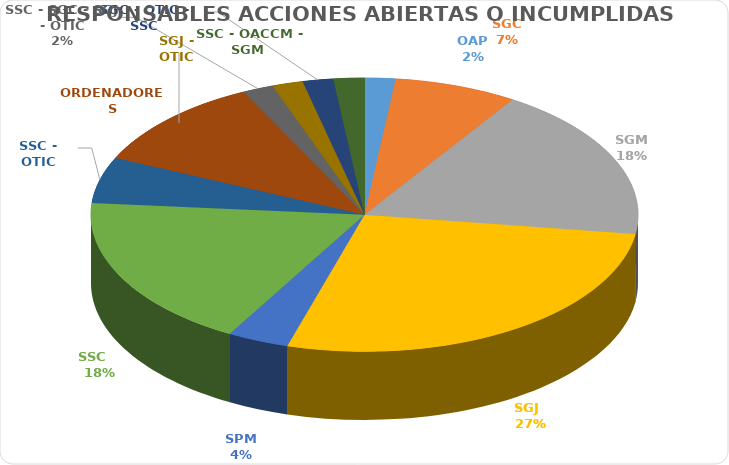
| Category | Series 0 |
|---|---|
| OAP | 1 |
| SGC | 4 |
| SGM | 10 |
| SGJ   | 15 |
| SPM | 2 |
| SSC    | 10 |
| SSC - OTIC | 3 |
| ORDENADORES | 6 |
| SSC - SGC - SGJ - OTIC | 1 |
| SGJ - OTIC | 1 |
| SGC - OTIC - SSC | 1 |
| SSC - OACCM - SGM  | 1 |